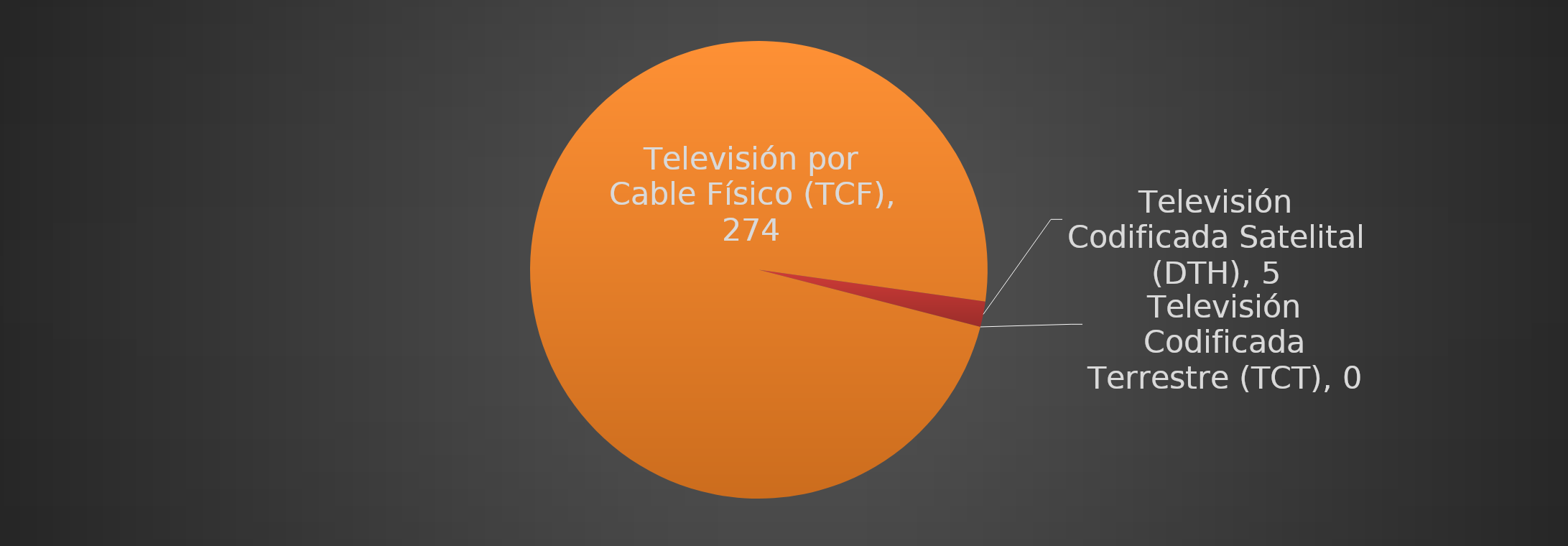
| Category | Televisión Codificada Satelital (DTH) |
|---|---|
| Televisión Codificada Satelital (DTH) | 5 |
| Televisión Codificada Terrestre (TCT) | 0 |
| Televisión por Cable Físico (TCF) | 274 |